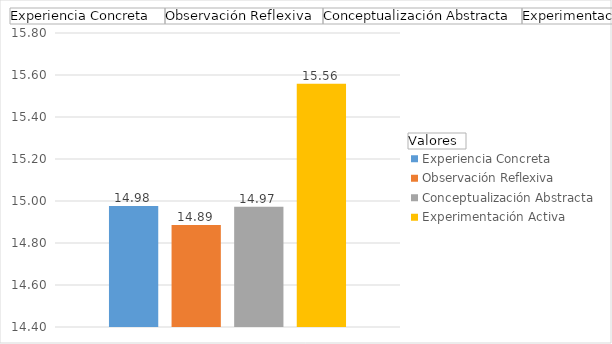
| Category | Experiencia Concreta  | Observación Reflexiva | Conceptualización Abstracta | Experimentación Activa |
|---|---|---|---|---|
| Total | 14.976 | 14.885 | 14.972 | 15.558 |